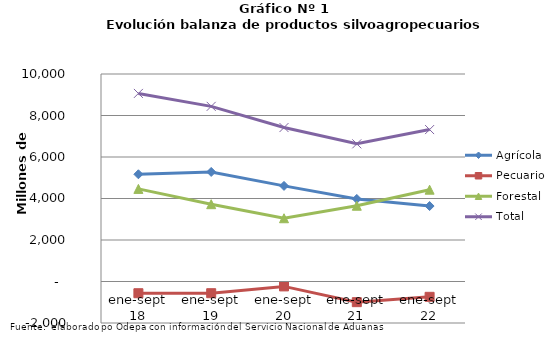
| Category | Agrícola | Pecuario | Forestal | Total |
|---|---|---|---|---|
| ene-sept 18 | 5167366 | -565487 | 4462457 | 9064336 |
| ene-sept 19 | 5279949 | -564158 | 3725321 | 8441112 |
| ene-sept 20 | 4607167 | -236305 | 3048820 | 7419682 |
| ene-sept 21 | 3978795 | -995933 | 3651539 | 6634401 |
| ene-sept 22 | 3636322 | -738401 | 4424156 | 7322077 |